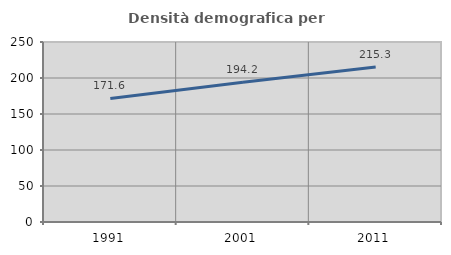
| Category | Densità demografica |
|---|---|
| 1991.0 | 171.639 |
| 2001.0 | 194.199 |
| 2011.0 | 215.325 |